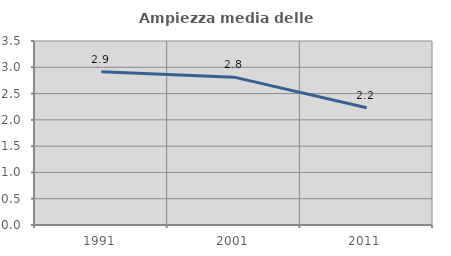
| Category | Ampiezza media delle famiglie |
|---|---|
| 1991.0 | 2.917 |
| 2001.0 | 2.812 |
| 2011.0 | 2.23 |